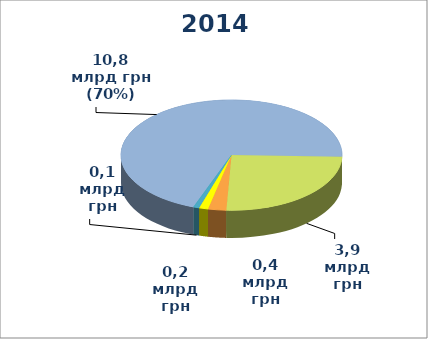
| Category | Series 0 |
|---|---|
| Складське господарство та допоміжна діяльність у сфері транспорту | 10837 |
| Наземний і трубопровідний транспорт | 3916.2 |
| Авіаційний транспорт | 410.2 |
| Водний транспорт | 204.8 |
| Поштова та кур’єрська діяльність | 130 |